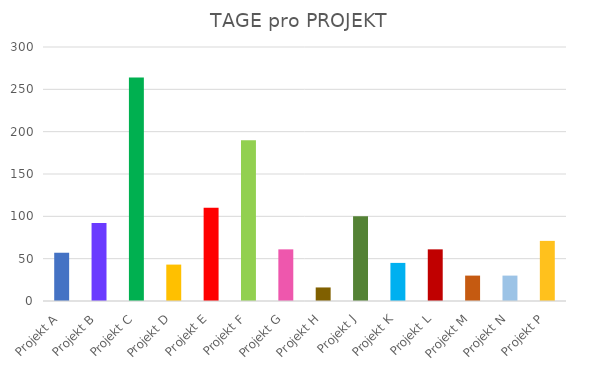
| Category | ANZAHL DER TAGE |
|---|---|
| Projekt A | 57 |
| Projekt B | 92 |
| Projekt C | 264 |
| Projekt D | 43 |
| Projekt E | 110 |
| Projekt F | 190 |
| Projekt G | 61 |
| Projekt H | 16 |
| Projekt J | 100 |
| Projekt K | 45 |
| Projekt L | 61 |
| Projekt M | 30 |
| Projekt N | 30 |
| Projekt P | 71 |